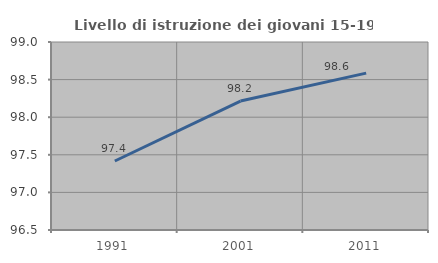
| Category | Livello di istruzione dei giovani 15-19 anni |
|---|---|
| 1991.0 | 97.417 |
| 2001.0 | 98.214 |
| 2011.0 | 98.586 |